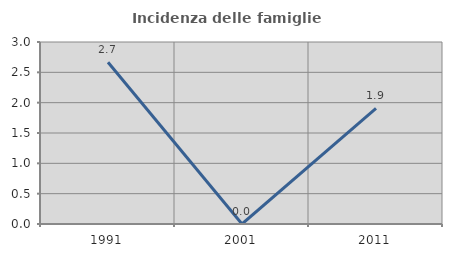
| Category | Incidenza delle famiglie numerose |
|---|---|
| 1991.0 | 2.667 |
| 2001.0 | 0 |
| 2011.0 | 1.905 |